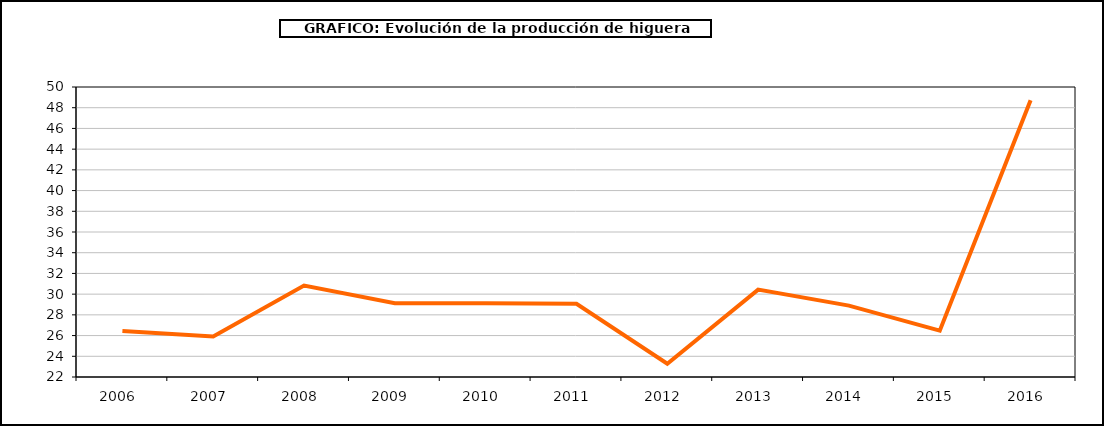
| Category | producción higuera |
|---|---|
| 2006.0 | 26.442 |
| 2007.0 | 25.906 |
| 2008.0 | 30.828 |
| 2009.0 | 29.12 |
| 2010.0 | 29.12 |
| 2011.0 | 29.071 |
| 2012.0 | 23.285 |
| 2013.0 | 30.434 |
| 2014.0 | 28.893 |
| 2015.0 | 26.479 |
| 2016.0 | 48.718 |